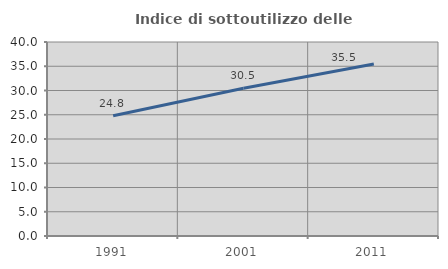
| Category | Indice di sottoutilizzo delle abitazioni  |
|---|---|
| 1991.0 | 24.789 |
| 2001.0 | 30.457 |
| 2011.0 | 35.454 |